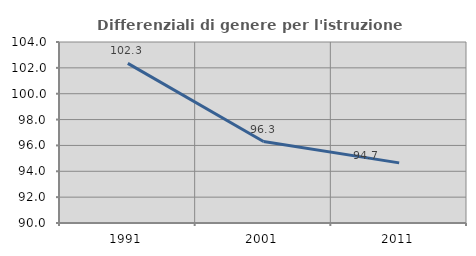
| Category | Differenziali di genere per l'istruzione superiore |
|---|---|
| 1991.0 | 102.346 |
| 2001.0 | 96.299 |
| 2011.0 | 94.651 |